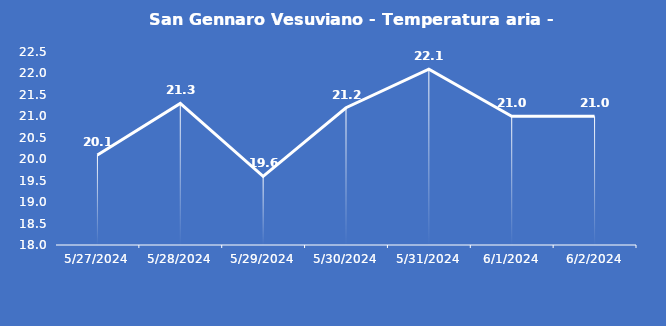
| Category | San Gennaro Vesuviano - Temperatura aria - Grezzo (°C) |
|---|---|
| 5/27/24 | 20.1 |
| 5/28/24 | 21.3 |
| 5/29/24 | 19.6 |
| 5/30/24 | 21.2 |
| 5/31/24 | 22.1 |
| 6/1/24 | 21 |
| 6/2/24 | 21 |